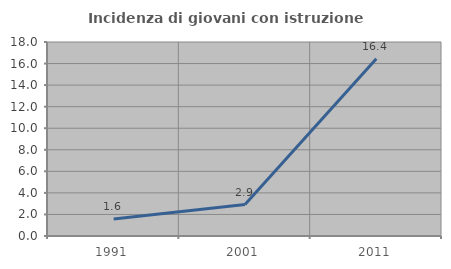
| Category | Incidenza di giovani con istruzione universitaria |
|---|---|
| 1991.0 | 1.587 |
| 2001.0 | 2.92 |
| 2011.0 | 16.443 |